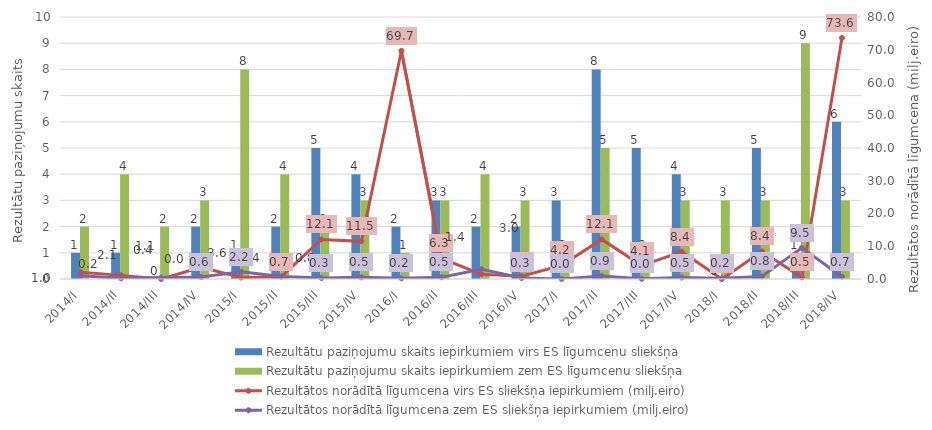
| Category | Rezultātu paziņojumu skaits iepirkumiem virs ES līgumcenu sliekšņa | Rezultātu paziņojumu skaits iepirkumiem zem ES līgumcenu sliekšņa |
|---|---|---|
| 2014/I | 1 | 2 |
| 2014/II | 1 | 4 |
| 2014/III | 0 | 2 |
| 2014/IV | 2 | 3 |
| 2015/I | 1 | 8 |
| 2015/II | 2 | 4 |
| 2015/III | 5 | 2 |
| 2015/IV | 4 | 3 |
| 2016/I | 2 | 1 |
| 2016/II | 3 | 3 |
| 2016/III | 2 | 4 |
| 2016/IV | 2 | 3 |
| 2017/I | 3 | 1 |
| 2017/II | 8 | 5 |
| 2017/III | 5 | 1 |
| 2017/IV | 4 | 3 |
| 2018/I | 0 | 3 |
| 2018/II | 5 | 3 |
| 2018/III | 1 | 9 |
| 2018/IV | 6 | 3 |